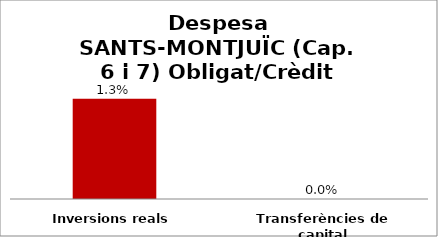
| Category | Series 0 |
|---|---|
| Inversions reals | 0.013 |
| Transferències de capital | 0 |